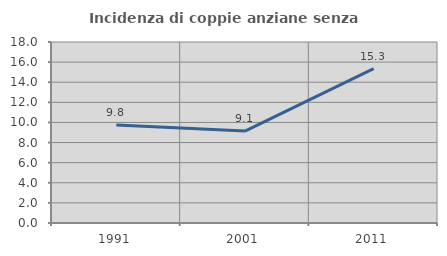
| Category | Incidenza di coppie anziane senza figli  |
|---|---|
| 1991.0 | 9.751 |
| 2001.0 | 9.142 |
| 2011.0 | 15.347 |